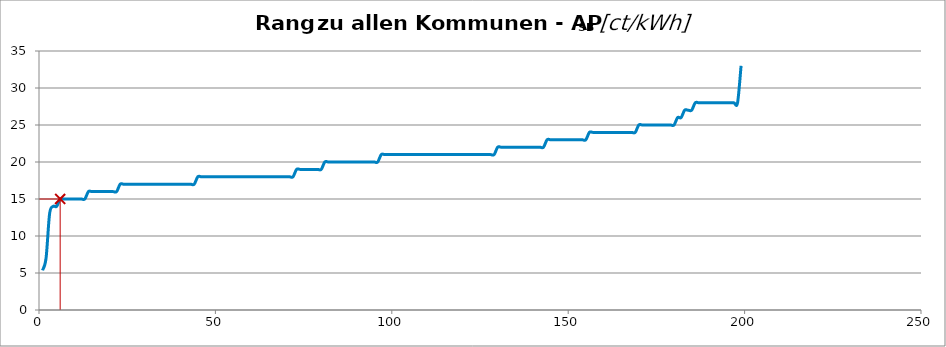
| Category | Kommunenrangfolge |
|---|---|
| 0 | 5.355 |
| 1 | 7 |
| 2 | 13 |
| 3 | 14 |
| 4 | 14 |
| 5 | 15 |
| 6 | 15 |
| 7 | 15 |
| 8 | 15 |
| 9 | 15 |
| 10 | 15 |
| 11 | 15 |
| 12 | 15 |
| 13 | 16 |
| 14 | 16 |
| 15 | 16 |
| 16 | 16 |
| 17 | 16 |
| 18 | 16 |
| 19 | 16 |
| 20 | 16 |
| 21 | 16 |
| 22 | 17 |
| 23 | 17 |
| 24 | 17 |
| 25 | 17 |
| 26 | 17 |
| 27 | 17 |
| 28 | 17 |
| 29 | 17 |
| 30 | 17 |
| 31 | 17 |
| 32 | 17 |
| 33 | 17 |
| 34 | 17 |
| 35 | 17 |
| 36 | 17 |
| 37 | 17 |
| 38 | 17 |
| 39 | 17 |
| 40 | 17 |
| 41 | 17 |
| 42 | 17 |
| 43 | 17 |
| 44 | 18 |
| 45 | 18 |
| 46 | 18 |
| 47 | 18 |
| 48 | 18 |
| 49 | 18 |
| 50 | 18 |
| 51 | 18 |
| 52 | 18 |
| 53 | 18 |
| 54 | 18 |
| 55 | 18 |
| 56 | 18 |
| 57 | 18 |
| 58 | 18 |
| 59 | 18 |
| 60 | 18 |
| 61 | 18 |
| 62 | 18 |
| 63 | 18 |
| 64 | 18 |
| 65 | 18 |
| 66 | 18 |
| 67 | 18 |
| 68 | 18 |
| 69 | 18 |
| 70 | 18 |
| 71 | 18 |
| 72 | 19 |
| 73 | 19 |
| 74 | 19 |
| 75 | 19 |
| 76 | 19 |
| 77 | 19 |
| 78 | 19 |
| 79 | 19 |
| 80 | 20 |
| 81 | 20 |
| 82 | 20 |
| 83 | 20 |
| 84 | 20 |
| 85 | 20 |
| 86 | 20 |
| 87 | 20 |
| 88 | 20 |
| 89 | 20 |
| 90 | 20 |
| 91 | 20 |
| 92 | 20 |
| 93 | 20 |
| 94 | 20 |
| 95 | 20 |
| 96 | 21 |
| 97 | 21 |
| 98 | 21 |
| 99 | 21 |
| 100 | 21 |
| 101 | 21 |
| 102 | 21 |
| 103 | 21 |
| 104 | 21 |
| 105 | 21 |
| 106 | 21 |
| 107 | 21 |
| 108 | 21 |
| 109 | 21 |
| 110 | 21 |
| 111 | 21 |
| 112 | 21 |
| 113 | 21 |
| 114 | 21 |
| 115 | 21 |
| 116 | 21 |
| 117 | 21 |
| 118 | 21 |
| 119 | 21 |
| 120 | 21 |
| 121 | 21 |
| 122 | 21 |
| 123 | 21 |
| 124 | 21 |
| 125 | 21 |
| 126 | 21 |
| 127 | 21 |
| 128 | 21 |
| 129 | 22 |
| 130 | 22 |
| 131 | 22 |
| 132 | 22 |
| 133 | 22 |
| 134 | 22 |
| 135 | 22 |
| 136 | 22 |
| 137 | 22 |
| 138 | 22 |
| 139 | 22 |
| 140 | 22 |
| 141 | 22 |
| 142 | 22 |
| 143 | 23 |
| 144 | 23 |
| 145 | 23 |
| 146 | 23 |
| 147 | 23 |
| 148 | 23 |
| 149 | 23 |
| 150 | 23 |
| 151 | 23 |
| 152 | 23 |
| 153 | 23 |
| 154 | 23 |
| 155 | 24 |
| 156 | 24 |
| 157 | 24 |
| 158 | 24 |
| 159 | 24 |
| 160 | 24 |
| 161 | 24 |
| 162 | 24 |
| 163 | 24 |
| 164 | 24 |
| 165 | 24 |
| 166 | 24 |
| 167 | 24 |
| 168 | 24 |
| 169 | 25 |
| 170 | 25 |
| 171 | 25 |
| 172 | 25 |
| 173 | 25 |
| 174 | 25 |
| 175 | 25 |
| 176 | 25 |
| 177 | 25 |
| 178 | 25 |
| 179 | 25 |
| 180 | 26 |
| 181 | 26 |
| 182 | 27 |
| 183 | 27 |
| 184 | 27 |
| 185 | 28 |
| 186 | 28 |
| 187 | 28 |
| 188 | 28 |
| 189 | 28 |
| 190 | 28 |
| 191 | 28 |
| 192 | 28 |
| 193 | 28 |
| 194 | 28 |
| 195 | 28 |
| 196 | 28 |
| 197 | 28 |
| 198 | 33 |